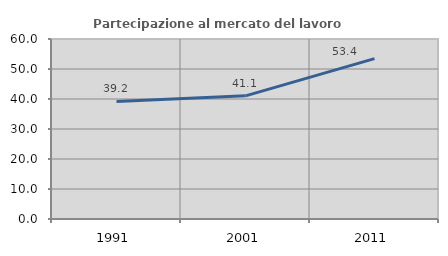
| Category | Partecipazione al mercato del lavoro  femminile |
|---|---|
| 1991.0 | 39.206 |
| 2001.0 | 41.057 |
| 2011.0 | 53.448 |